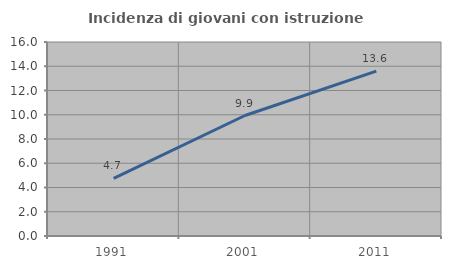
| Category | Incidenza di giovani con istruzione universitaria |
|---|---|
| 1991.0 | 4.749 |
| 2001.0 | 9.938 |
| 2011.0 | 13.596 |